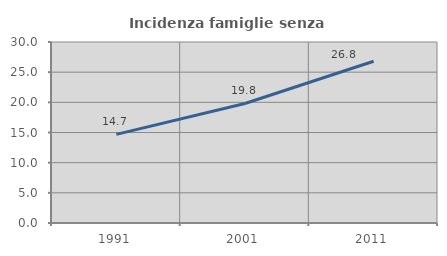
| Category | Incidenza famiglie senza nuclei |
|---|---|
| 1991.0 | 14.69 |
| 2001.0 | 19.812 |
| 2011.0 | 26.806 |